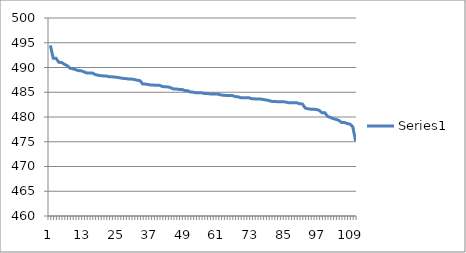
| Category | Series 0 |
|---|---|
| 0 | 494.455 |
| 1 | 491.89 |
| 2 | 491.88 |
| 3 | 491.05 |
| 4 | 491.013 |
| 5 | 490.65 |
| 6 | 490.37 |
| 7 | 489.86 |
| 8 | 489.75 |
| 9 | 489.56 |
| 10 | 489.377 |
| 11 | 489.335 |
| 12 | 489.11 |
| 13 | 488.89 |
| 14 | 488.886 |
| 15 | 488.886 |
| 16 | 488.57 |
| 17 | 488.44 |
| 18 | 488.34 |
| 19 | 488.302 |
| 20 | 488.3 |
| 21 | 488.12 |
| 22 | 488.12 |
| 23 | 488.07 |
| 24 | 487.99 |
| 25 | 487.89 |
| 26 | 487.8 |
| 27 | 487.76 |
| 28 | 487.66 |
| 29 | 487.658 |
| 30 | 487.57 |
| 31 | 487.44 |
| 32 | 487.328 |
| 33 | 486.66 |
| 34 | 486.659 |
| 35 | 486.54 |
| 36 | 486.46 |
| 37 | 486.44 |
| 38 | 486.4 |
| 39 | 486.39 |
| 40 | 486.16 |
| 41 | 486.1 |
| 42 | 486.08 |
| 43 | 485.89 |
| 44 | 485.66 |
| 45 | 485.66 |
| 46 | 485.57 |
| 47 | 485.57 |
| 48 | 485.34 |
| 49 | 485.32 |
| 50 | 485.05 |
| 51 | 485.02 |
| 52 | 484.896 |
| 53 | 484.892 |
| 54 | 484.89 |
| 55 | 484.77 |
| 56 | 484.76 |
| 57 | 484.67 |
| 58 | 484.66 |
| 59 | 484.65 |
| 60 | 484.6 |
| 61 | 484.44 |
| 62 | 484.39 |
| 63 | 484.34 |
| 64 | 484.34 |
| 65 | 484.32 |
| 66 | 484.123 |
| 67 | 484.08 |
| 68 | 483.89 |
| 69 | 483.89 |
| 70 | 483.89 |
| 71 | 483.876 |
| 72 | 483.67 |
| 73 | 483.66 |
| 74 | 483.65 |
| 75 | 483.64 |
| 76 | 483.54 |
| 77 | 483.44 |
| 78 | 483.33 |
| 79 | 483.16 |
| 80 | 483.124 |
| 81 | 483.1 |
| 82 | 483.1 |
| 83 | 483.1 |
| 84 | 483.02 |
| 85 | 482.895 |
| 86 | 482.895 |
| 87 | 482.89 |
| 88 | 482.881 |
| 89 | 482.665 |
| 90 | 482.64 |
| 91 | 481.811 |
| 92 | 481.66 |
| 93 | 481.58 |
| 94 | 481.56 |
| 95 | 481.52 |
| 96 | 481.34 |
| 97 | 480.87 |
| 98 | 480.87 |
| 99 | 480.13 |
| 100 | 479.9 |
| 101 | 479.669 |
| 102 | 479.53 |
| 103 | 479.32 |
| 104 | 478.9 |
| 105 | 478.9 |
| 106 | 478.68 |
| 107 | 478.56 |
| 108 | 478.01 |
| 109 | 475.143 |